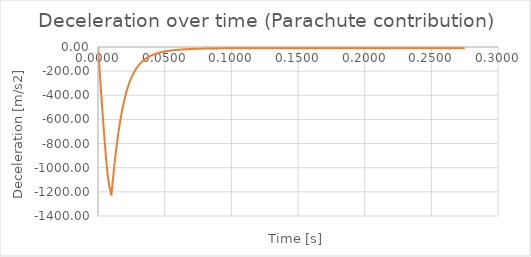
| Category | Parachute contribution |
|---|---|
| 0.0 | 0 |
| 0.0025 | -402.344 |
| 0.005 | -782.665 |
| 0.0075 | -1081.444 |
| 0.01 | -1228.874 |
| 0.0125 | -956.333 |
| 0.015000000000000001 | -733.094 |
| 0.0175 | -559.043 |
| 0.02 | -427.073 |
| 0.0225 | -328.333 |
| 0.024999999999999998 | -254.735 |
| 0.027499999999999997 | -199.757 |
| 0.029999999999999995 | -158.45 |
| 0.032499999999999994 | -127.17 |
| 0.034999999999999996 | -103.269 |
| 0.0375 | -84.837 |
| 0.04 | -70.488 |
| 0.0425 | -59.214 |
| 0.045000000000000005 | -50.279 |
| 0.04750000000000001 | -43.138 |
| 0.05000000000000001 | -37.386 |
| 0.05250000000000001 | -32.72 |
| 0.055000000000000014 | -28.907 |
| 0.057500000000000016 | -25.774 |
| 0.06000000000000002 | -23.185 |
| 0.06250000000000001 | -21.034 |
| 0.06500000000000002 | -19.239 |
| 0.06750000000000002 | -17.735 |
| 0.07000000000000002 | -16.471 |
| 0.07250000000000002 | -15.405 |
| 0.07500000000000002 | -14.505 |
| 0.07750000000000003 | -13.743 |
| 0.08000000000000003 | -13.098 |
| 0.08250000000000003 | -12.551 |
| 0.08500000000000003 | -12.086 |
| 0.08750000000000004 | -11.693 |
| 0.09000000000000004 | -11.36 |
| 0.09250000000000004 | -11.078 |
| 0.09500000000000004 | -10.839 |
| 0.09750000000000004 | -10.639 |
| 0.10000000000000005 | -10.47 |
| 0.10250000000000005 | -10.329 |
| 0.10500000000000005 | -10.21 |
| 0.10750000000000005 | -10.112 |
| 0.11000000000000006 | -10.031 |
| 0.11250000000000006 | -9.963 |
| 0.11500000000000006 | -9.908 |
| 0.11750000000000006 | -9.862 |
| 0.12000000000000006 | -9.825 |
| 0.12250000000000007 | -9.795 |
| 0.12500000000000006 | -9.771 |
| 0.12750000000000006 | -9.752 |
| 0.13000000000000006 | -9.736 |
| 0.13250000000000006 | -9.724 |
| 0.13500000000000006 | -9.714 |
| 0.13750000000000007 | -9.706 |
| 0.14000000000000007 | -9.7 |
| 0.14250000000000007 | -9.696 |
| 0.14500000000000007 | -9.692 |
| 0.14750000000000008 | -9.689 |
| 0.15000000000000008 | -9.687 |
| 0.15250000000000008 | -9.686 |
| 0.15500000000000008 | -9.684 |
| 0.15750000000000008 | -9.684 |
| 0.1600000000000001 | -9.683 |
| 0.1625000000000001 | -9.682 |
| 0.1650000000000001 | -9.682 |
| 0.1675000000000001 | -9.682 |
| 0.1700000000000001 | -9.682 |
| 0.1725000000000001 | -9.681 |
| 0.1750000000000001 | -9.681 |
| 0.1775000000000001 | -9.681 |
| 0.1800000000000001 | -9.681 |
| 0.1825000000000001 | -9.681 |
| 0.1850000000000001 | -9.681 |
| 0.1875000000000001 | -9.681 |
| 0.1900000000000001 | -9.681 |
| 0.19250000000000012 | -9.681 |
| 0.19500000000000012 | -9.681 |
| 0.19750000000000012 | -9.681 |
| 0.20000000000000012 | -9.681 |
| 0.20250000000000012 | -9.681 |
| 0.20500000000000013 | -9.681 |
| 0.20750000000000013 | -9.681 |
| 0.21000000000000013 | -9.681 |
| 0.21250000000000013 | -9.681 |
| 0.21500000000000014 | -9.681 |
| 0.21750000000000014 | -9.681 |
| 0.22000000000000014 | -9.681 |
| 0.22250000000000014 | -9.681 |
| 0.22500000000000014 | -9.681 |
| 0.22750000000000015 | -9.681 |
| 0.23000000000000015 | -9.681 |
| 0.23250000000000015 | -9.681 |
| 0.23500000000000015 | -9.681 |
| 0.23750000000000016 | -9.681 |
| 0.24000000000000016 | -9.681 |
| 0.24250000000000016 | -9.681 |
| 0.24500000000000016 | -9.681 |
| 0.24750000000000016 | -9.681 |
| 0.25000000000000017 | -9.681 |
| 0.25250000000000017 | -9.681 |
| 0.25500000000000017 | -9.681 |
| 0.2575000000000002 | -9.681 |
| 0.2600000000000002 | -9.681 |
| 0.2625000000000002 | -9.681 |
| 0.2650000000000002 | -9.681 |
| 0.2675000000000002 | -9.681 |
| 0.2700000000000002 | -9.681 |
| 0.2725000000000002 | -9.681 |
| 0.2750000000000002 | -9.681 |